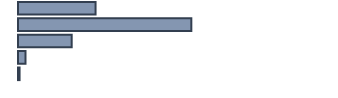
| Category | 24,7 |
|---|---|
| 0 | 24.7 |
| 1 | 55.2 |
| 2 | 17.1 |
| 3 | 2.4 |
| 4 | 0.5 |